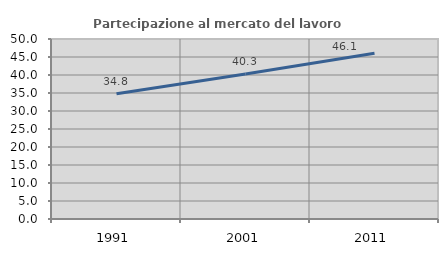
| Category | Partecipazione al mercato del lavoro  femminile |
|---|---|
| 1991.0 | 34.765 |
| 2001.0 | 40.289 |
| 2011.0 | 46.06 |